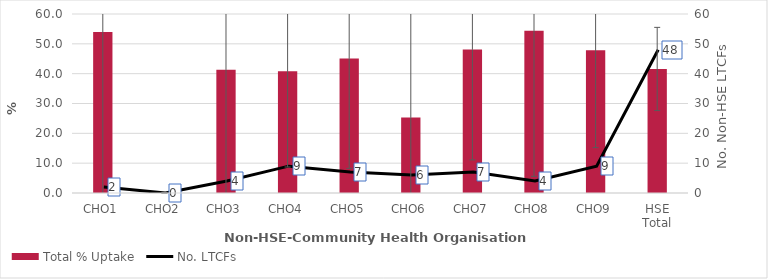
| Category | Total % Uptake |
|---|---|
| CHO1 | 53.933 |
| CHO2 | 0 |
| CHO3 | 41.321 |
| CHO4 | 40.818 |
| CHO5 | 45.123 |
| CHO6 | 25.273 |
| CHO7 | 48.105 |
| CHO8 | 54.4 |
| CHO9 | 47.848 |
| HSE Total | 41.577 |